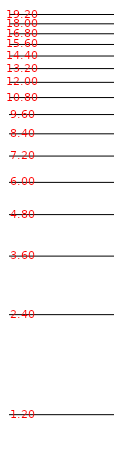
| Category | Series 0 |
|---|---|
| 0.0 | 0.182 |
| 0.0 | 0.875 |
| 0.0 | 1.281 |
| 0.0 | 1.569 |
| 0.0 | 1.792 |
| 0.0 | 1.974 |
| 0.0 | 2.128 |
| 0.0 | 2.262 |
| 0.0 | 2.38 |
| 0.0 | 2.485 |
| 0.0 | 2.58 |
| 0.0 | 2.667 |
| 0.0 | 2.747 |
| 0.0 | 2.821 |
| 0.0 | 2.89 |
| 0.0 | 2.955 |
| 0.0 | 3.016 |
| 0.0 | 3.073 |
| 0.0 | 3.127 |
| 0.0 | 3.178 |
| 0.0 | 3.227 |
| 0.0 | 3.273 |
| 0.0 | 3.318 |
| 0.0 | 3.36 |
| 0.0 | 3.401 |
| 0.0 | 3.44 |
| 0.0 | 3.478 |